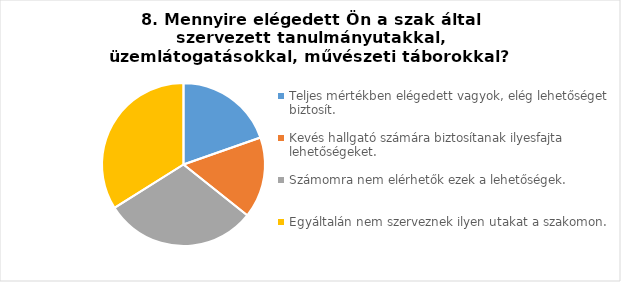
| Category | Series 0 |
|---|---|
| Teljes mértékben elégedett vagyok, elég lehetőséget biztosít. | 19.64 |
| Kevés hallgató számára biztosítanak ilyesfajta lehetőségeket. | 16.07 |
| Számomra nem elérhetők ezek a lehetőségek. | 30.36 |
| Egyáltalán nem szerveznek ilyen utakat a szakomon. | 33.93 |